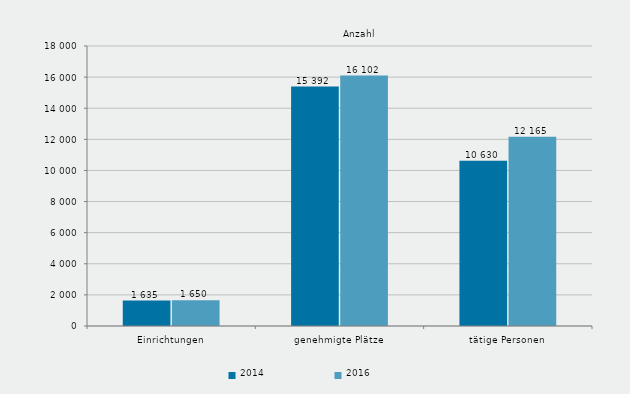
| Category | 2014 | 2016 |
|---|---|---|
| Einrichtungen | 1635 | 1650 |
| genehmigte Plätze | 15392 | 16102 |
| tätige Personen | 10630 | 12165 |